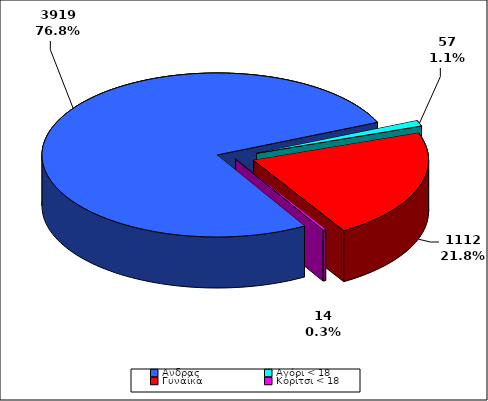
| Category | ΣΥΝΟΛΟ |
|---|---|
| Aνδρας | 3919 |
| Αγόρι < 18 | 57 |
| Γυναίκα | 1112 |
| Κορίτσι < 18 | 14 |